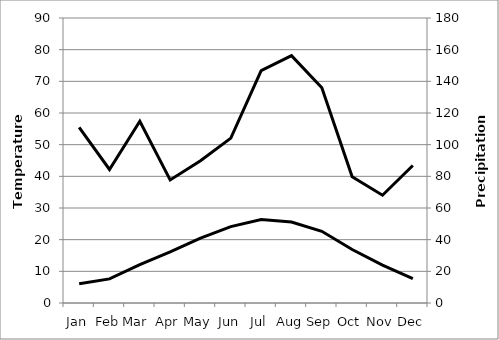
| Category | Series 0 |
|---|---|
| Jan | 6.05 |
| Feb | 7.61 |
| Mar  | 12.11 |
| Apr | 16.11 |
| May | 20.5 |
| Jun | 24.11 |
| Jul | 26.38 |
| Aug  | 25.55 |
| Sep | 22.65 |
| Oct | 16.88 |
| Nov | 11.94 |
| Dec | 7.72 |